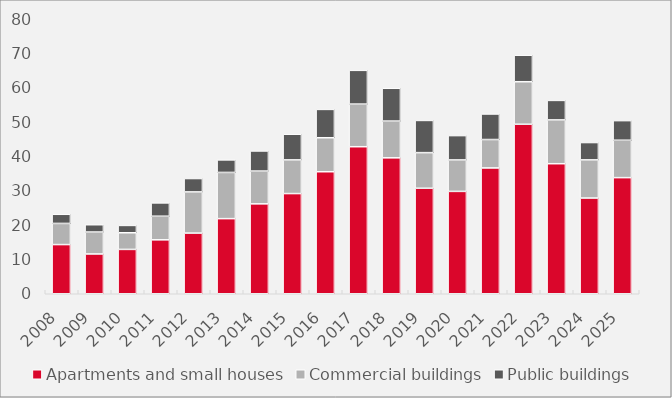
| Category | Apartments and small houses | Commercial buildings | Public buildings |
|---|---|---|---|
| 2008.0 | 14.309 | 6.15 | 2.657 |
| 2009.0 | 11.578 | 6.379 | 2.124 |
| 2010.0 | 12.904 | 4.837 | 2.137 |
| 2011.0 | 15.687 | 6.87 | 3.87 |
| 2012.0 | 17.649 | 11.978 | 3.893 |
| 2013.0 | 21.853 | 13.438 | 3.648 |
| 2014.0 | 26.151 | 9.544 | 5.845 |
| 2015.0 | 29.143 | 9.801 | 7.464 |
| 2016.0 | 35.498 | 9.884 | 8.247 |
| 2017.0 | 42.774 | 12.402 | 9.819 |
| 2018.0 | 39.543 | 10.691 | 9.542 |
| 2019.0 | 30.691 | 10.36 | 9.368 |
| 2020.0 | 29.78 | 9.15 | 7.083 |
| 2021.0 | 36.606 | 8.259 | 7.434 |
| 2022.0 | 49.311 | 12.368 | 7.714 |
| 2023.0 | 37.829 | 12.746 | 5.673 |
| 2024.0 | 27.849 | 11.101 | 5.039 |
| 2025.0 | 33.781 | 10.879 | 5.707 |